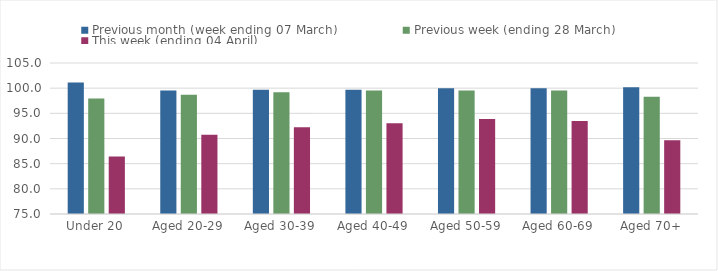
| Category | Previous month (week ending 07 March) | Previous week (ending 28 March) | This week (ending 04 April) |
|---|---|---|---|
| Under 20 | 101.134 | 97.969 | 86.435 |
| Aged 20-29 | 99.544 | 98.71 | 90.745 |
| Aged 30-39 | 99.663 | 99.171 | 92.259 |
| Aged 40-49 | 99.675 | 99.543 | 93.042 |
| Aged 50-59 | 99.961 | 99.555 | 93.867 |
| Aged 60-69 | 99.987 | 99.546 | 93.47 |
| Aged 70+ | 100.171 | 98.297 | 89.671 |